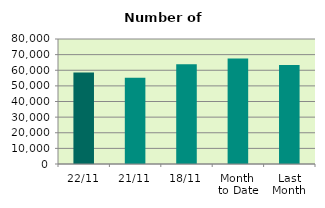
| Category | Series 0 |
|---|---|
| 22/11 | 58486 |
| 21/11 | 55248 |
| 18/11 | 63812 |
| Month 
to Date | 67480.75 |
| Last
Month | 63348.667 |